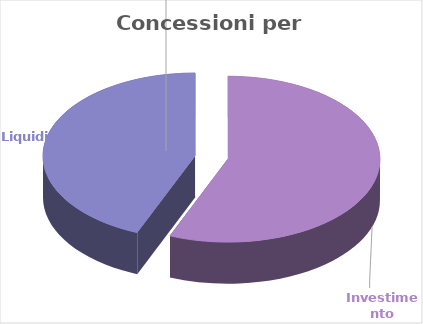
| Category | Series 0 |
|---|---|
| Investimento | 83217244 |
| Liquidità  | 64834000 |